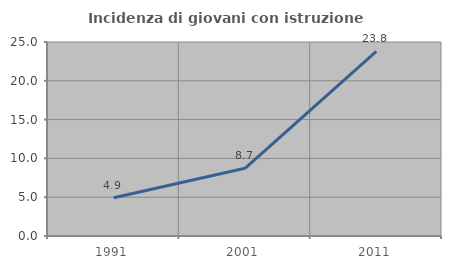
| Category | Incidenza di giovani con istruzione universitaria |
|---|---|
| 1991.0 | 4.922 |
| 2001.0 | 8.727 |
| 2011.0 | 23.782 |